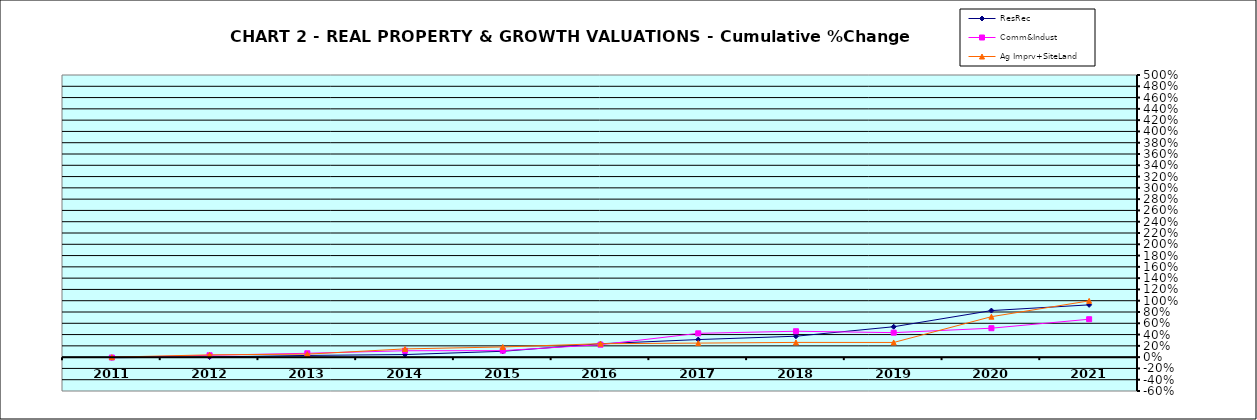
| Category | ResRec | Comm&Indust | Ag Imprv+SiteLand |
|---|---|---|---|
| 2011.0 | -0.01 | -0.007 | 0 |
| 2012.0 | 0.002 | 0.033 | 0.041 |
| 2013.0 | 0.03 | 0.069 | 0.053 |
| 2014.0 | 0.046 | 0.113 | 0.146 |
| 2015.0 | 0.104 | 0.115 | 0.181 |
| 2016.0 | 0.237 | 0.221 | 0.238 |
| 2017.0 | 0.312 | 0.422 | 0.249 |
| 2018.0 | 0.371 | 0.459 | 0.261 |
| 2019.0 | 0.539 | 0.434 | 0.26 |
| 2020.0 | 0.825 | 0.513 | 0.717 |
| 2021.0 | 0.926 | 0.672 | 0.997 |